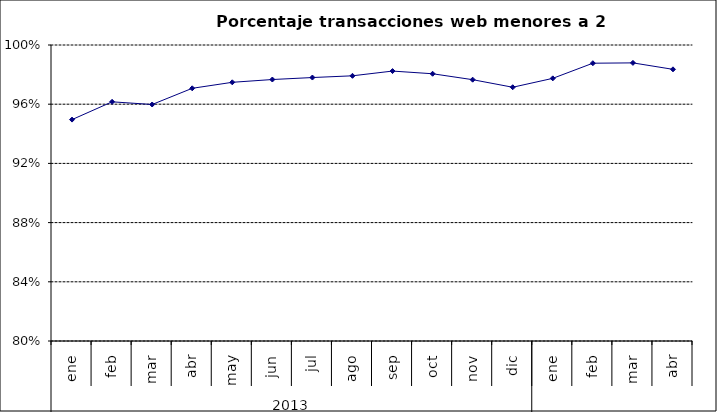
| Category | 94,96% 96,16% 95,98% 97,07% 97,48% 97,67% 97,80% 97,92% 98,24% 98,06% 97,66% 97,15% 97,75% 98,77% 98,79% 98,36% |
|---|---|
| 0 | 0.95 |
| 1 | 0.962 |
| 2 | 0.96 |
| 3 | 0.971 |
| 4 | 0.975 |
| 5 | 0.977 |
| 6 | 0.978 |
| 7 | 0.979 |
| 8 | 0.982 |
| 9 | 0.981 |
| 10 | 0.977 |
| 11 | 0.971 |
| 12 | 0.977 |
| 13 | 0.988 |
| 14 | 0.988 |
| 15 | 0.984 |